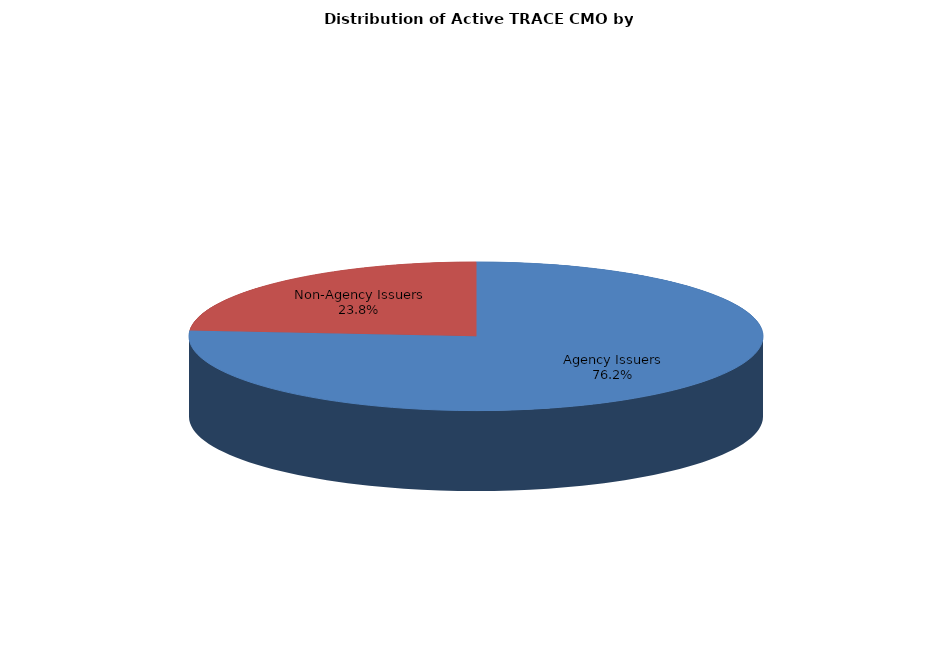
| Category | Series 0 |
|---|---|
| Agency Issuers | 244540 |
| Non-Agency Issuers | 76197 |